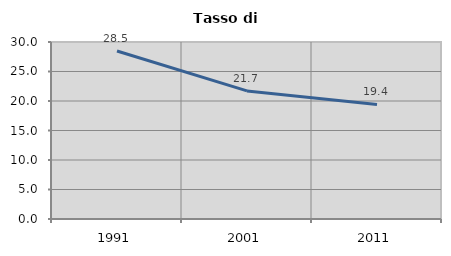
| Category | Tasso di disoccupazione   |
|---|---|
| 1991.0 | 28.476 |
| 2001.0 | 21.705 |
| 2011.0 | 19.42 |